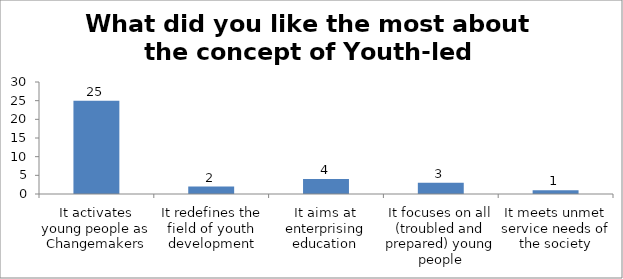
| Category | What did you like the most about the concept of Youth-led Changemaking? |
|---|---|
| It activates young people as Changemakers | 25 |
| It redefines the field of youth development | 2 |
| It aims at enterprising education | 4 |
| It focuses on all (troubled and prepared) young people | 3 |
| It meets unmet service needs of the society | 1 |